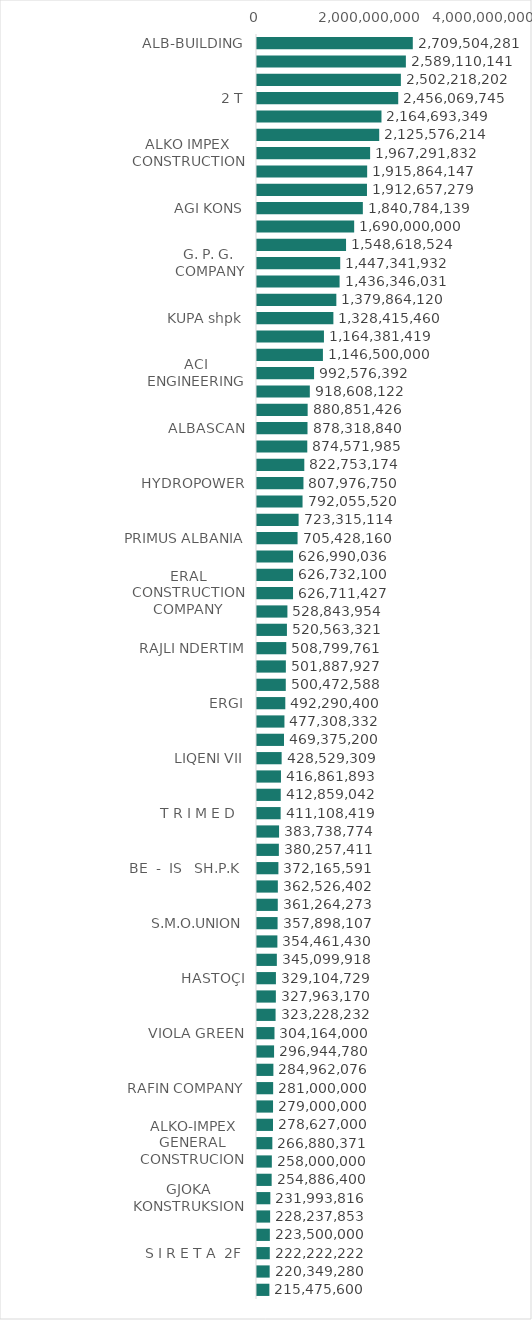
| Category | Oferta Fituese pa TVSH |
|---|---|
| ALB-BUILDING | 2709504280.61 |
| 4 A-M | 2589110140.68 |
| SALILLARI | 2502218202.06 |
| 2 T | 2456069745.07 |
| A. N. K. | 2164693349.44 |
| MC NETWORKING | 2125576214.05 |
| ALKO IMPEX CONSTRUCTION | 1967291832 |
| LA - OR | 1915864146.73 |
| GTS-GAZRA TEKNIKE SHQIPTARE SH.P.K. | 1912657279 |
| AGI KONS | 1840784139.32 |
| KASTRATI | 1690000000 |
| ANTE-GROUP | 1548618524 |
| G. P. G. COMPANY | 1447341932 |
| "GENER 2" | 1436346030.87 |
| ADVANCED BUSINESS SOLUTIONS - ABS | 1379864120 |
| KUPA shpk | 1328415460 |
| GJIKURIA | 1164381419.3 |
| SELAMI | 1146500000 |
| ACI ENGINEERING | 992576392.35 |
| INFOSOFT SYSTEMS | 918608122 |
| GECI | 880851426 |
| ALBASCAN | 878318840 |
| PRIMA ENERGY | 874571984.54 |
| DION-AL | 822753174 |
| HYDROPOWER | 807976750 |
| COBIAL | 792055520.4 |
| NOVA  CONSTRUCTION 2012 | 723315114.4 |
| PRIMUS ALBANIA | 705428160 |
| FUSHA | 626990035.58 |
| MARSI &amp; AL | 626732100 |
| ERAL CONSTRUCTION COMPANY | 626711427 |
| FLED | 528843954 |
| "MEGAPHARMA"
 | 520563321 |
| RAJLI NDERTIM | 508799761 |
| Inerti SHPK	 | 501887927 |
| PEPA GROUP | 500472588 |
| ERGI | 492290400 |
| PROGEEN | 477308332 |
| ALBANIA MOTOR COMPANY | 469375200 |
| LIQENI VII | 428529309 |
| EURONDERTIMI 2000 | 416861893 |
| NDERTUESI 2014
 | 412859042 |
| T R I M E D
 | 411108419 |
| VALONA KONSTRUKSION | 383738774 |
| ARB & TRANS-2010 | 380257411 |
| BE  -  IS   SH.P.K | 372165591 |
| ULZA | 362526402 |
| BESTA | 361264273 |
| S.M.O.UNION | 357898107 |
| H O R I Z O N | 354461430 |
| 5D KONSTRUKSION | 345099918 |
| HASTOÇI | 329104729 |
| S & T ALBANIA | 327963170 |
| BAJRAMI N. | 323228231.5 |
| VIOLA GREEN | 304164000 |
| FLENA RB
 | 296944780 |
| CURRI | 284962076.18 |
| RAFIN COMPANY | 281000000 |
| KLAJGER KONSTRUKSION SHPK | 279000000 |
| MONTAL
 | 278627000 |
| ALKO-IMPEX GENERAL CONSTRUCION | 266880370.5 |
| SHENDELLI SHPK | 258000000 |
| AGBES CONSTRUKSION | 254886400 |
| GJOKA KONSTRUKSION | 231993815.55 |
| ALB  TIEFBAU | 228237853 |
| ILIRIADA | 223500000 |
| S I R E T A  2F | 222222222 |
| R & T | 220349280 |
| ALBANIAN SATELLITE COMMUNICATIONS | 215475600 |